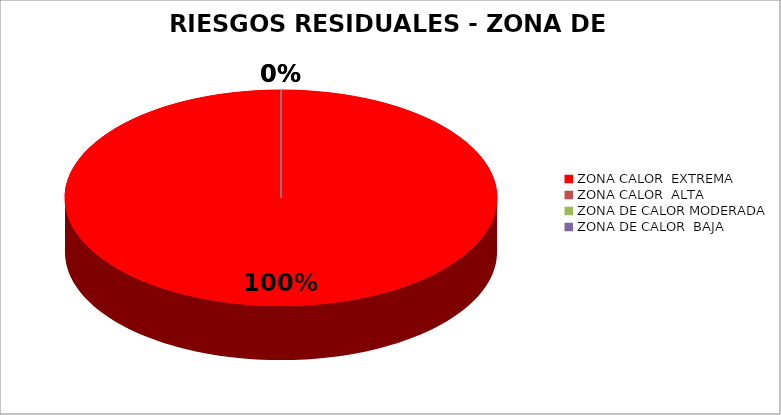
| Category | Series 0 |
|---|---|
| ZONA CALOR  EXTREMA | 5 |
| ZONA CALOR  ALTA | 0 |
| ZONA DE CALOR MODERADA | 0 |
| ZONA DE CALOR  BAJA | 0 |